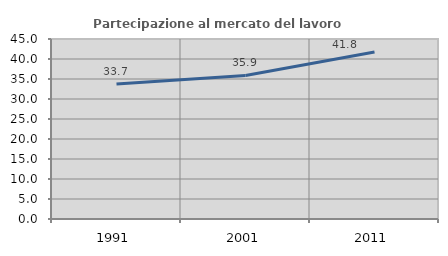
| Category | Partecipazione al mercato del lavoro  femminile |
|---|---|
| 1991.0 | 33.743 |
| 2001.0 | 35.889 |
| 2011.0 | 41.76 |